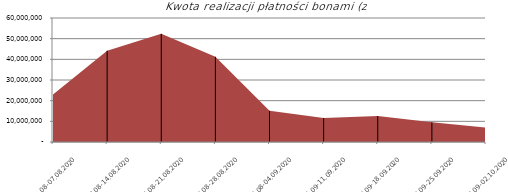
| Category | Kwota realizacji płatności bonami (zł) | Series 1 |
|---|---|---|
| 01.08-07.08.2020 | 22962396.11 |  |
| 08.08-14.08.2020 | 44134317.06 |  |
| 15.08-21.08.2020 | 52334816.93 |  |
| 22.08-28.08.2020 | 41223224.44 |  |
| 29.08-04.09.2020 | 15089118.73 |  |
| 05.09-11.09.2020 | 11625392.1 |  |
| 12.09-18.09.2020 | 12529523.18 |  |
| 19.09-25.09.2020 | 9513473.35 |  |
| 26.09-02.10.2020 | 6916961.06 |  |